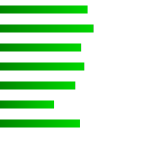
| Category | Series 0 |
|---|---|
| 0 | 230935 |
| 1 | 246655 |
| 2 | 213696 |
| 3 | 222039 |
| 4 | 198025 |
| 5 | 141451 |
| 6 | 210590 |